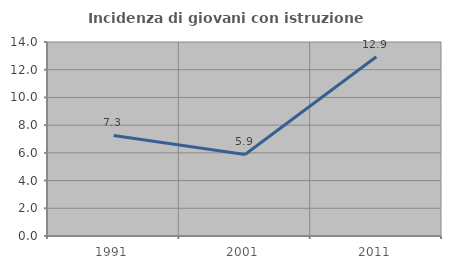
| Category | Incidenza di giovani con istruzione universitaria |
|---|---|
| 1991.0 | 7.258 |
| 2001.0 | 5.882 |
| 2011.0 | 12.941 |